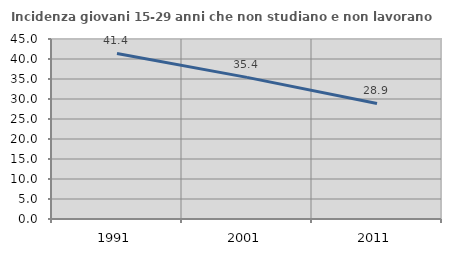
| Category | Incidenza giovani 15-29 anni che non studiano e non lavorano  |
|---|---|
| 1991.0 | 41.379 |
| 2001.0 | 35.41 |
| 2011.0 | 28.876 |